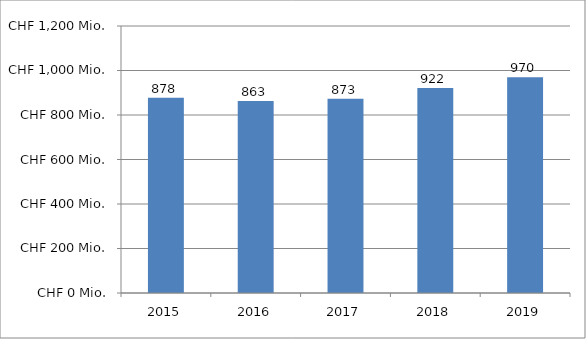
| Category | Series 0 |
|---|---|
| 2015.0 | 877815554 |
| 2016.0 | 862858482 |
| 2017.0 | 873045016 |
| 2018.0 | 921689890 |
| 2019.0 | 969704368 |